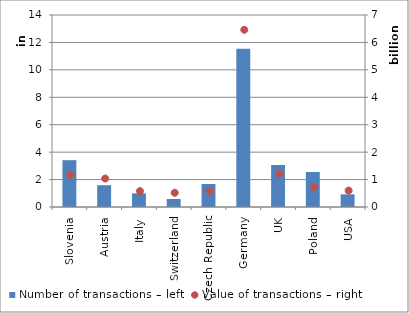
| Category | Number of transactions – left |
|---|---|
| Slovenia | 3414059 |
| Austria | 1588364 |
| Italy | 993582 |
| Switzerland | 583353 |
| Czech Republic | 1675239 |
| Germany | 11537137 |
| UK | 3063841 |
| Poland | 2551766 |
| USA | 925301 |